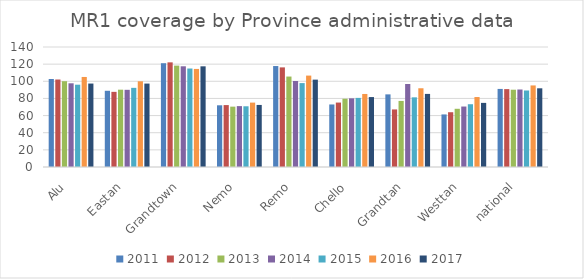
| Category | 2011 | 2012 | 2013 | 2014 | 2015 | 2016 | 2017 |
|---|---|---|---|---|---|---|---|
| Alu | 102.655 | 102.073 | 100.105 | 97.654 | 96.025 | 105.043 | 97.362 |
| Eastan | 88.925 | 87.667 | 90.202 | 90.045 | 92.345 | 99.988 | 97.33 |
| Grandtown | 121.076 | 122.092 | 118.298 | 117.492 | 114.899 | 114.42 | 117.456 |
| Nemo | 71.986 | 72.241 | 70.42 | 71.045 | 70.844 | 75.131 | 72.401 |
| Remo | 117.791 | 116.216 | 105.529 | 100.336 | 97.893 | 106.643 | 101.925 |
| Chello | 72.961 | 75.178 | 79.64 | 80.113 | 80.609 | 85.204 | 81.593 |
| Grandtan | 84.733 | 67.162 | 77.083 | 96.859 | 81.263 | 91.858 | 85.28 |
| Westtan | 61.334 | 63.903 | 67.922 | 70.546 | 73.234 | 81.627 | 74.806 |
| national | 91.094 | 90.861 | 90.159 | 90.418 | 89.26 | 95.16 | 91.811 |